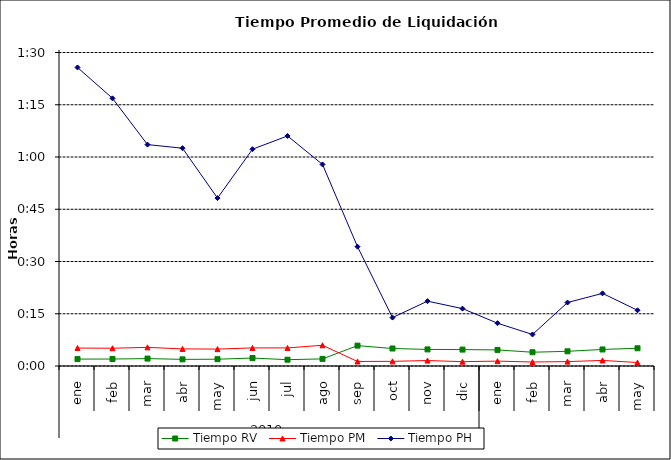
| Category | Tiempo RV | Tiempo PM | Tiempo PH |
|---|---|---|---|
| 0 | 0.001 | 0.004 | 0.06 |
| 1 | 0.001 | 0.004 | 0.053 |
| 2 | 0.001 | 0.004 | 0.044 |
| 3 | 0.001 | 0.003 | 0.043 |
| 4 | 0.001 | 0.003 | 0.033 |
| 5 | 0.002 | 0.004 | 0.043 |
| 6 | 0.001 | 0.004 | 0.046 |
| 7 | 0.001 | 0.004 | 0.04 |
| 8 | 0.004 | 0.001 | 0.024 |
| 9 | 0.003 | 0.001 | 0.01 |
| 10 | 0.003 | 0.001 | 0.013 |
| 11 | 0.003 | 0.001 | 0.011 |
| 12 | 0.003 | 0.001 | 0.009 |
| 13 | 0.003 | 0.001 | 0.006 |
| 14 | 0.003 | 0.001 | 0.013 |
| 15 | 0.003 | 0.001 | 0.014 |
| 16 | 0.004 | 0.001 | 0.011 |